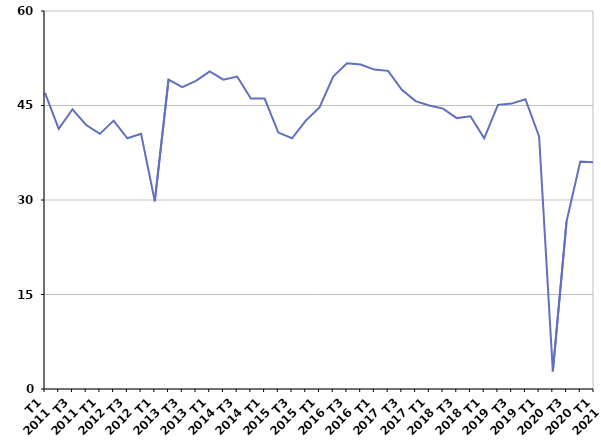
| Category | Radiation administrative |
|---|---|
| T1
2011 | 47 |
| T2
2011 | 41.3 |
| T3
2011 | 44.4 |
| T4
2011 | 41.9 |
| T1
2012 | 40.5 |
| T2
2012 | 42.6 |
| T3
2012 | 39.8 |
| T4
2012 | 40.5 |
| T1
2013 | 29.8 |
| T2
2013 | 49.1 |
| T3
2013 | 47.9 |
| T4
2013 | 48.9 |
| T1
2014 | 50.4 |
| T2
2014 | 49.1 |
| T3
2014 | 49.6 |
| T4
2014 | 46.1 |
| T1
2015 | 46.1 |
| T2
2015 | 40.7 |
| T3
2015 | 39.8 |
| T4
2015 | 42.6 |
| T1
2016 | 44.7 |
| T2
2016 | 49.6 |
| T3
2016 | 51.7 |
| T4
2016 | 51.5 |
| T1
2017 | 50.7 |
| T2
2017 | 50.5 |
| T3
2017 | 47.5 |
| T4
2017 | 45.7 |
| T1
2018 | 45 |
| T2
2018 | 44.5 |
| T3
2018 | 43 |
| T4
2018 | 43.3 |
| T1
2019 | 39.8 |
| T2
2019 | 45.1 |
| T3
2019 | 45.3 |
| T4
2019 | 46 |
| T1
2020 | 40.1 |
| T2
2020 | 2.8 |
| T3
2020 | 26.6 |
| T4
2020 | 36.1 |
| T1
2021 | 36 |